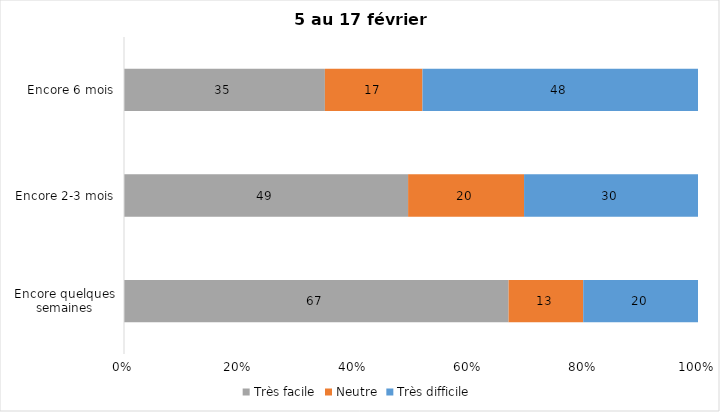
| Category | Très facile | Neutre | Très difficile |
|---|---|---|---|
| Encore quelques semaines | 67 | 13 | 20 |
| Encore 2-3 mois | 49 | 20 | 30 |
| Encore 6 mois | 35 | 17 | 48 |